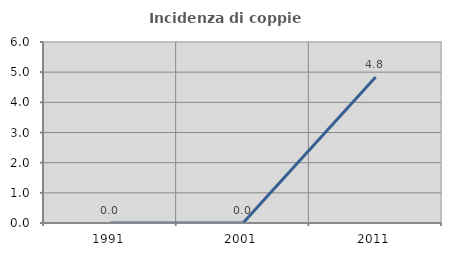
| Category | Incidenza di coppie miste |
|---|---|
| 1991.0 | 0 |
| 2001.0 | 0 |
| 2011.0 | 4.839 |